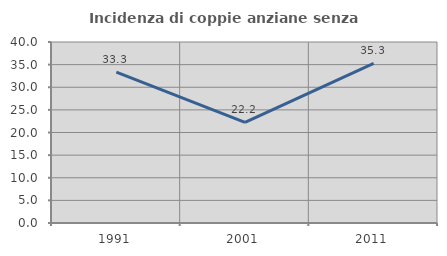
| Category | Incidenza di coppie anziane senza figli  |
|---|---|
| 1991.0 | 33.333 |
| 2001.0 | 22.222 |
| 2011.0 | 35.294 |